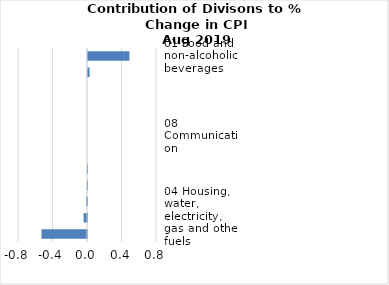
| Category |     Contributions |
|---|---|
| 01 Food and non-alcoholic beverages | 0.48 |
| 12 Miscellaneous goods and services | 0.019 |
| 10 Education | 0 |
| 11 Restaurants and hotels | 0 |
| 06 Health | 0 |
| 08 Communication | 0 |
| 09 Recreation and culture | 0 |
| 03 Clothing and footwear | 0 |
| 02 Alcoholic beverages, tobacco and narcotics | -0.002 |
| 05 Furnishings, household equipment and routine household maintenance | -0.011 |
| 04 Housing, water, electricity, gas and other fuels | -0.039 |
| 07 Transport | -0.528 |